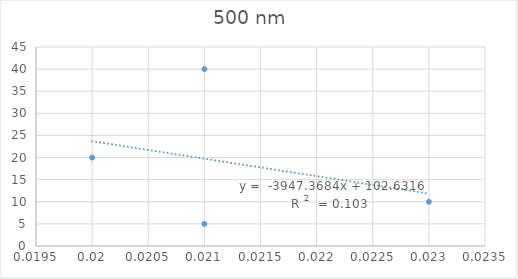
| Category | Series 0 |
|---|---|
| 0.021 | 5 |
| 0.023 | 10 |
| 0.02 | 20 |
| 0.021 | 40 |